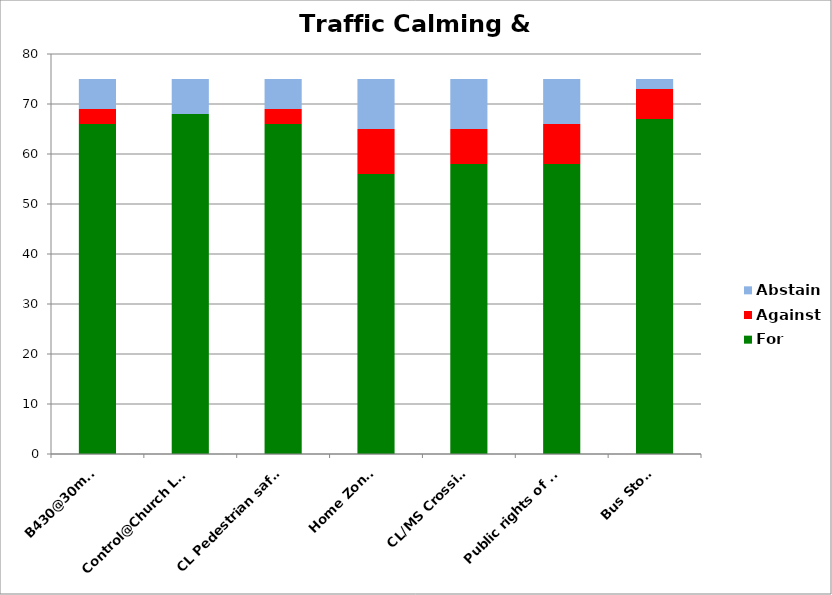
| Category | For | Against | Abstain |
|---|---|---|---|
| B430@30mph | 66 | 3 | 6 |
| Control@Church Lane | 68 | 0 | 7 |
| CL Pedestrian safety | 66 | 3 | 6 |
| Home Zones | 56 | 9 | 10 |
| CL/MS Crossing | 58 | 7 | 10 |
| Public rights of way | 58 | 8 | 9 |
| Bus Stops | 67 | 6 | 2 |